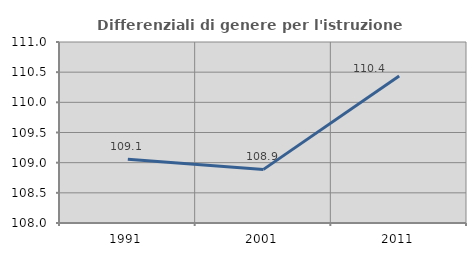
| Category | Differenziali di genere per l'istruzione superiore |
|---|---|
| 1991.0 | 109.057 |
| 2001.0 | 108.889 |
| 2011.0 | 110.437 |